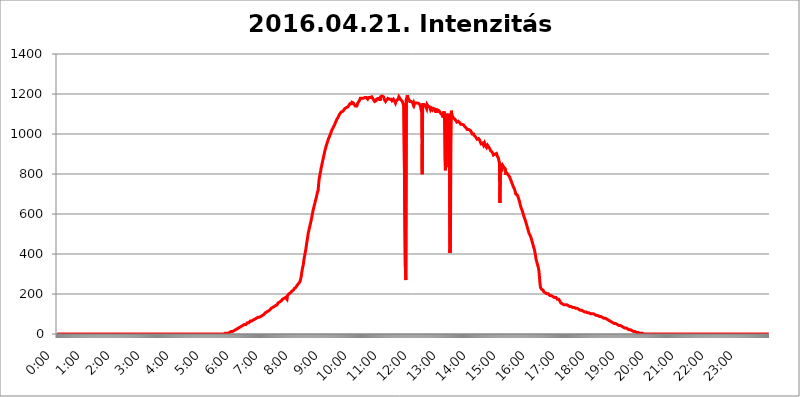
| Category | 2016.04.21. Intenzitás [W/m^2] |
|---|---|
| 0.0 | 0 |
| 0.0006944444444444445 | 0 |
| 0.001388888888888889 | 0 |
| 0.0020833333333333333 | 0 |
| 0.002777777777777778 | 0 |
| 0.003472222222222222 | 0 |
| 0.004166666666666667 | 0 |
| 0.004861111111111111 | 0 |
| 0.005555555555555556 | 0 |
| 0.0062499999999999995 | 0 |
| 0.006944444444444444 | 0 |
| 0.007638888888888889 | 0 |
| 0.008333333333333333 | 0 |
| 0.009027777777777779 | 0 |
| 0.009722222222222222 | 0 |
| 0.010416666666666666 | 0 |
| 0.011111111111111112 | 0 |
| 0.011805555555555555 | 0 |
| 0.012499999999999999 | 0 |
| 0.013194444444444444 | 0 |
| 0.013888888888888888 | 0 |
| 0.014583333333333332 | 0 |
| 0.015277777777777777 | 0 |
| 0.015972222222222224 | 0 |
| 0.016666666666666666 | 0 |
| 0.017361111111111112 | 0 |
| 0.018055555555555557 | 0 |
| 0.01875 | 0 |
| 0.019444444444444445 | 0 |
| 0.02013888888888889 | 0 |
| 0.020833333333333332 | 0 |
| 0.02152777777777778 | 0 |
| 0.022222222222222223 | 0 |
| 0.02291666666666667 | 0 |
| 0.02361111111111111 | 0 |
| 0.024305555555555556 | 0 |
| 0.024999999999999998 | 0 |
| 0.025694444444444447 | 0 |
| 0.02638888888888889 | 0 |
| 0.027083333333333334 | 0 |
| 0.027777777777777776 | 0 |
| 0.02847222222222222 | 0 |
| 0.029166666666666664 | 0 |
| 0.029861111111111113 | 0 |
| 0.030555555555555555 | 0 |
| 0.03125 | 0 |
| 0.03194444444444445 | 0 |
| 0.03263888888888889 | 0 |
| 0.03333333333333333 | 0 |
| 0.034027777777777775 | 0 |
| 0.034722222222222224 | 0 |
| 0.035416666666666666 | 0 |
| 0.036111111111111115 | 0 |
| 0.03680555555555556 | 0 |
| 0.0375 | 0 |
| 0.03819444444444444 | 0 |
| 0.03888888888888889 | 0 |
| 0.03958333333333333 | 0 |
| 0.04027777777777778 | 0 |
| 0.04097222222222222 | 0 |
| 0.041666666666666664 | 0 |
| 0.042361111111111106 | 0 |
| 0.04305555555555556 | 0 |
| 0.043750000000000004 | 0 |
| 0.044444444444444446 | 0 |
| 0.04513888888888889 | 0 |
| 0.04583333333333334 | 0 |
| 0.04652777777777778 | 0 |
| 0.04722222222222222 | 0 |
| 0.04791666666666666 | 0 |
| 0.04861111111111111 | 0 |
| 0.049305555555555554 | 0 |
| 0.049999999999999996 | 0 |
| 0.05069444444444445 | 0 |
| 0.051388888888888894 | 0 |
| 0.052083333333333336 | 0 |
| 0.05277777777777778 | 0 |
| 0.05347222222222222 | 0 |
| 0.05416666666666667 | 0 |
| 0.05486111111111111 | 0 |
| 0.05555555555555555 | 0 |
| 0.05625 | 0 |
| 0.05694444444444444 | 0 |
| 0.057638888888888885 | 0 |
| 0.05833333333333333 | 0 |
| 0.05902777777777778 | 0 |
| 0.059722222222222225 | 0 |
| 0.06041666666666667 | 0 |
| 0.061111111111111116 | 0 |
| 0.06180555555555556 | 0 |
| 0.0625 | 0 |
| 0.06319444444444444 | 0 |
| 0.06388888888888888 | 0 |
| 0.06458333333333334 | 0 |
| 0.06527777777777778 | 0 |
| 0.06597222222222222 | 0 |
| 0.06666666666666667 | 0 |
| 0.06736111111111111 | 0 |
| 0.06805555555555555 | 0 |
| 0.06874999999999999 | 0 |
| 0.06944444444444443 | 0 |
| 0.07013888888888889 | 0 |
| 0.07083333333333333 | 0 |
| 0.07152777777777779 | 0 |
| 0.07222222222222223 | 0 |
| 0.07291666666666667 | 0 |
| 0.07361111111111111 | 0 |
| 0.07430555555555556 | 0 |
| 0.075 | 0 |
| 0.07569444444444444 | 0 |
| 0.0763888888888889 | 0 |
| 0.07708333333333334 | 0 |
| 0.07777777777777778 | 0 |
| 0.07847222222222222 | 0 |
| 0.07916666666666666 | 0 |
| 0.0798611111111111 | 0 |
| 0.08055555555555556 | 0 |
| 0.08125 | 0 |
| 0.08194444444444444 | 0 |
| 0.08263888888888889 | 0 |
| 0.08333333333333333 | 0 |
| 0.08402777777777777 | 0 |
| 0.08472222222222221 | 0 |
| 0.08541666666666665 | 0 |
| 0.08611111111111112 | 0 |
| 0.08680555555555557 | 0 |
| 0.08750000000000001 | 0 |
| 0.08819444444444445 | 0 |
| 0.08888888888888889 | 0 |
| 0.08958333333333333 | 0 |
| 0.09027777777777778 | 0 |
| 0.09097222222222222 | 0 |
| 0.09166666666666667 | 0 |
| 0.09236111111111112 | 0 |
| 0.09305555555555556 | 0 |
| 0.09375 | 0 |
| 0.09444444444444444 | 0 |
| 0.09513888888888888 | 0 |
| 0.09583333333333333 | 0 |
| 0.09652777777777777 | 0 |
| 0.09722222222222222 | 0 |
| 0.09791666666666667 | 0 |
| 0.09861111111111111 | 0 |
| 0.09930555555555555 | 0 |
| 0.09999999999999999 | 0 |
| 0.10069444444444443 | 0 |
| 0.1013888888888889 | 0 |
| 0.10208333333333335 | 0 |
| 0.10277777777777779 | 0 |
| 0.10347222222222223 | 0 |
| 0.10416666666666667 | 0 |
| 0.10486111111111111 | 0 |
| 0.10555555555555556 | 0 |
| 0.10625 | 0 |
| 0.10694444444444444 | 0 |
| 0.1076388888888889 | 0 |
| 0.10833333333333334 | 0 |
| 0.10902777777777778 | 0 |
| 0.10972222222222222 | 0 |
| 0.1111111111111111 | 0 |
| 0.11180555555555556 | 0 |
| 0.11180555555555556 | 0 |
| 0.1125 | 0 |
| 0.11319444444444444 | 0 |
| 0.11388888888888889 | 0 |
| 0.11458333333333333 | 0 |
| 0.11527777777777777 | 0 |
| 0.11597222222222221 | 0 |
| 0.11666666666666665 | 0 |
| 0.1173611111111111 | 0 |
| 0.11805555555555557 | 0 |
| 0.11944444444444445 | 0 |
| 0.12013888888888889 | 0 |
| 0.12083333333333333 | 0 |
| 0.12152777777777778 | 0 |
| 0.12222222222222223 | 0 |
| 0.12291666666666667 | 0 |
| 0.12291666666666667 | 0 |
| 0.12361111111111112 | 0 |
| 0.12430555555555556 | 0 |
| 0.125 | 0 |
| 0.12569444444444444 | 0 |
| 0.12638888888888888 | 0 |
| 0.12708333333333333 | 0 |
| 0.16875 | 0 |
| 0.12847222222222224 | 0 |
| 0.12916666666666668 | 0 |
| 0.12986111111111112 | 0 |
| 0.13055555555555556 | 0 |
| 0.13125 | 0 |
| 0.13194444444444445 | 0 |
| 0.1326388888888889 | 0 |
| 0.13333333333333333 | 0 |
| 0.13402777777777777 | 0 |
| 0.13402777777777777 | 0 |
| 0.13472222222222222 | 0 |
| 0.13541666666666666 | 0 |
| 0.1361111111111111 | 0 |
| 0.13749999999999998 | 0 |
| 0.13819444444444443 | 0 |
| 0.1388888888888889 | 0 |
| 0.13958333333333334 | 0 |
| 0.14027777777777778 | 0 |
| 0.14097222222222222 | 0 |
| 0.14166666666666666 | 0 |
| 0.1423611111111111 | 0 |
| 0.14305555555555557 | 0 |
| 0.14375000000000002 | 0 |
| 0.14444444444444446 | 0 |
| 0.1451388888888889 | 0 |
| 0.1451388888888889 | 0 |
| 0.14652777777777778 | 0 |
| 0.14722222222222223 | 0 |
| 0.14791666666666667 | 0 |
| 0.1486111111111111 | 0 |
| 0.14930555555555555 | 0 |
| 0.15 | 0 |
| 0.15069444444444444 | 0 |
| 0.15138888888888888 | 0 |
| 0.15208333333333332 | 0 |
| 0.15277777777777776 | 0 |
| 0.15347222222222223 | 0 |
| 0.15416666666666667 | 0 |
| 0.15486111111111112 | 0 |
| 0.15555555555555556 | 0 |
| 0.15625 | 0 |
| 0.15694444444444444 | 0 |
| 0.15763888888888888 | 0 |
| 0.15833333333333333 | 0 |
| 0.15902777777777777 | 0 |
| 0.15972222222222224 | 0 |
| 0.16041666666666668 | 0 |
| 0.16111111111111112 | 0 |
| 0.16180555555555556 | 0 |
| 0.1625 | 0 |
| 0.16319444444444445 | 0 |
| 0.1638888888888889 | 0 |
| 0.16458333333333333 | 0 |
| 0.16527777777777777 | 0 |
| 0.16597222222222222 | 0 |
| 0.16666666666666666 | 0 |
| 0.1673611111111111 | 0 |
| 0.16805555555555554 | 0 |
| 0.16874999999999998 | 0 |
| 0.16944444444444443 | 0 |
| 0.17013888888888887 | 0 |
| 0.1708333333333333 | 0 |
| 0.17152777777777775 | 0 |
| 0.17222222222222225 | 0 |
| 0.1729166666666667 | 0 |
| 0.17361111111111113 | 0 |
| 0.17430555555555557 | 0 |
| 0.17500000000000002 | 0 |
| 0.17569444444444446 | 0 |
| 0.1763888888888889 | 0 |
| 0.17708333333333334 | 0 |
| 0.17777777777777778 | 0 |
| 0.17847222222222223 | 0 |
| 0.17916666666666667 | 0 |
| 0.1798611111111111 | 0 |
| 0.18055555555555555 | 0 |
| 0.18125 | 0 |
| 0.18194444444444444 | 0 |
| 0.1826388888888889 | 0 |
| 0.18333333333333335 | 0 |
| 0.1840277777777778 | 0 |
| 0.18472222222222223 | 0 |
| 0.18541666666666667 | 0 |
| 0.18611111111111112 | 0 |
| 0.18680555555555556 | 0 |
| 0.1875 | 0 |
| 0.18819444444444444 | 0 |
| 0.18888888888888888 | 0 |
| 0.18958333333333333 | 0 |
| 0.19027777777777777 | 0 |
| 0.1909722222222222 | 0 |
| 0.19166666666666665 | 0 |
| 0.19236111111111112 | 0 |
| 0.19305555555555554 | 0 |
| 0.19375 | 0 |
| 0.19444444444444445 | 0 |
| 0.1951388888888889 | 0 |
| 0.19583333333333333 | 0 |
| 0.19652777777777777 | 0 |
| 0.19722222222222222 | 0 |
| 0.19791666666666666 | 0 |
| 0.1986111111111111 | 0 |
| 0.19930555555555554 | 0 |
| 0.19999999999999998 | 0 |
| 0.20069444444444443 | 0 |
| 0.20138888888888887 | 0 |
| 0.2020833333333333 | 0 |
| 0.2027777777777778 | 0 |
| 0.2034722222222222 | 0 |
| 0.2041666666666667 | 0 |
| 0.20486111111111113 | 0 |
| 0.20555555555555557 | 0 |
| 0.20625000000000002 | 0 |
| 0.20694444444444446 | 0 |
| 0.2076388888888889 | 0 |
| 0.20833333333333334 | 0 |
| 0.20902777777777778 | 0 |
| 0.20972222222222223 | 0 |
| 0.21041666666666667 | 0 |
| 0.2111111111111111 | 0 |
| 0.21180555555555555 | 0 |
| 0.2125 | 0 |
| 0.21319444444444444 | 0 |
| 0.2138888888888889 | 0 |
| 0.21458333333333335 | 0 |
| 0.2152777777777778 | 0 |
| 0.21597222222222223 | 0 |
| 0.21666666666666667 | 0 |
| 0.21736111111111112 | 0 |
| 0.21805555555555556 | 0 |
| 0.21875 | 0 |
| 0.21944444444444444 | 0 |
| 0.22013888888888888 | 0 |
| 0.22083333333333333 | 0 |
| 0.22152777777777777 | 0 |
| 0.2222222222222222 | 0 |
| 0.22291666666666665 | 0 |
| 0.2236111111111111 | 0 |
| 0.22430555555555556 | 0 |
| 0.225 | 0 |
| 0.22569444444444445 | 0 |
| 0.2263888888888889 | 0 |
| 0.22708333333333333 | 0 |
| 0.22777777777777777 | 0 |
| 0.22847222222222222 | 0 |
| 0.22916666666666666 | 0 |
| 0.2298611111111111 | 0 |
| 0.23055555555555554 | 0 |
| 0.23124999999999998 | 0 |
| 0.23194444444444443 | 0 |
| 0.23263888888888887 | 0 |
| 0.2333333333333333 | 0 |
| 0.2340277777777778 | 0 |
| 0.2347222222222222 | 3.525 |
| 0.2354166666666667 | 3.525 |
| 0.23611111111111113 | 3.525 |
| 0.23680555555555557 | 3.525 |
| 0.23750000000000002 | 3.525 |
| 0.23819444444444446 | 3.525 |
| 0.2388888888888889 | 3.525 |
| 0.23958333333333334 | 3.525 |
| 0.24027777777777778 | 3.525 |
| 0.24097222222222223 | 7.887 |
| 0.24166666666666667 | 7.887 |
| 0.2423611111111111 | 7.887 |
| 0.24305555555555555 | 7.887 |
| 0.24375 | 12.257 |
| 0.24444444444444446 | 12.257 |
| 0.24513888888888888 | 12.257 |
| 0.24583333333333335 | 12.257 |
| 0.2465277777777778 | 12.257 |
| 0.24722222222222223 | 16.636 |
| 0.24791666666666667 | 16.636 |
| 0.24861111111111112 | 16.636 |
| 0.24930555555555556 | 21.024 |
| 0.25 | 21.024 |
| 0.25069444444444444 | 21.024 |
| 0.2513888888888889 | 25.419 |
| 0.2520833333333333 | 25.419 |
| 0.25277777777777777 | 25.419 |
| 0.2534722222222222 | 29.823 |
| 0.25416666666666665 | 29.823 |
| 0.2548611111111111 | 29.823 |
| 0.2555555555555556 | 34.234 |
| 0.25625000000000003 | 34.234 |
| 0.2569444444444445 | 34.234 |
| 0.2576388888888889 | 38.653 |
| 0.25833333333333336 | 38.653 |
| 0.2590277777777778 | 38.653 |
| 0.25972222222222224 | 38.653 |
| 0.2604166666666667 | 43.079 |
| 0.2611111111111111 | 43.079 |
| 0.26180555555555557 | 43.079 |
| 0.2625 | 47.511 |
| 0.26319444444444445 | 47.511 |
| 0.2638888888888889 | 47.511 |
| 0.26458333333333334 | 47.511 |
| 0.2652777777777778 | 51.951 |
| 0.2659722222222222 | 51.951 |
| 0.26666666666666666 | 56.398 |
| 0.2673611111111111 | 56.398 |
| 0.26805555555555555 | 56.398 |
| 0.26875 | 56.398 |
| 0.26944444444444443 | 60.85 |
| 0.2701388888888889 | 60.85 |
| 0.2708333333333333 | 65.31 |
| 0.27152777777777776 | 65.31 |
| 0.2722222222222222 | 65.31 |
| 0.27291666666666664 | 65.31 |
| 0.2736111111111111 | 65.31 |
| 0.2743055555555555 | 69.775 |
| 0.27499999999999997 | 69.775 |
| 0.27569444444444446 | 74.246 |
| 0.27638888888888885 | 74.246 |
| 0.27708333333333335 | 74.246 |
| 0.2777777777777778 | 74.246 |
| 0.27847222222222223 | 78.722 |
| 0.2791666666666667 | 78.722 |
| 0.2798611111111111 | 78.722 |
| 0.28055555555555556 | 78.722 |
| 0.28125 | 83.205 |
| 0.28194444444444444 | 83.205 |
| 0.2826388888888889 | 83.205 |
| 0.2833333333333333 | 83.205 |
| 0.28402777777777777 | 87.692 |
| 0.2847222222222222 | 87.692 |
| 0.28541666666666665 | 87.692 |
| 0.28611111111111115 | 92.184 |
| 0.28680555555555554 | 92.184 |
| 0.28750000000000003 | 92.184 |
| 0.2881944444444445 | 92.184 |
| 0.2888888888888889 | 96.682 |
| 0.28958333333333336 | 96.682 |
| 0.2902777777777778 | 101.184 |
| 0.29097222222222224 | 101.184 |
| 0.2916666666666667 | 105.69 |
| 0.2923611111111111 | 105.69 |
| 0.29305555555555557 | 105.69 |
| 0.29375 | 110.201 |
| 0.29444444444444445 | 110.201 |
| 0.2951388888888889 | 110.201 |
| 0.29583333333333334 | 114.716 |
| 0.2965277777777778 | 114.716 |
| 0.2972222222222222 | 119.235 |
| 0.29791666666666666 | 119.235 |
| 0.2986111111111111 | 119.235 |
| 0.29930555555555555 | 123.758 |
| 0.3 | 128.284 |
| 0.30069444444444443 | 128.284 |
| 0.3013888888888889 | 128.284 |
| 0.3020833333333333 | 132.814 |
| 0.30277777777777776 | 132.814 |
| 0.3034722222222222 | 137.347 |
| 0.30416666666666664 | 137.347 |
| 0.3048611111111111 | 137.347 |
| 0.3055555555555555 | 141.884 |
| 0.30624999999999997 | 141.884 |
| 0.3069444444444444 | 146.423 |
| 0.3076388888888889 | 146.423 |
| 0.30833333333333335 | 146.423 |
| 0.3090277777777778 | 150.964 |
| 0.30972222222222223 | 155.509 |
| 0.3104166666666667 | 155.509 |
| 0.3111111111111111 | 155.509 |
| 0.31180555555555556 | 160.056 |
| 0.3125 | 160.056 |
| 0.31319444444444444 | 164.605 |
| 0.3138888888888889 | 164.605 |
| 0.3145833333333333 | 169.156 |
| 0.31527777777777777 | 169.156 |
| 0.3159722222222222 | 173.709 |
| 0.31666666666666665 | 173.709 |
| 0.31736111111111115 | 173.709 |
| 0.31805555555555554 | 178.264 |
| 0.31875000000000003 | 182.82 |
| 0.3194444444444445 | 182.82 |
| 0.3201388888888889 | 182.82 |
| 0.32083333333333336 | 187.378 |
| 0.3215277777777778 | 187.378 |
| 0.32222222222222224 | 173.709 |
| 0.3229166666666667 | 191.937 |
| 0.3236111111111111 | 191.937 |
| 0.32430555555555557 | 196.497 |
| 0.325 | 201.058 |
| 0.32569444444444445 | 201.058 |
| 0.3263888888888889 | 201.058 |
| 0.32708333333333334 | 205.62 |
| 0.3277777777777778 | 210.182 |
| 0.3284722222222222 | 210.182 |
| 0.32916666666666666 | 214.746 |
| 0.3298611111111111 | 214.746 |
| 0.33055555555555555 | 219.309 |
| 0.33125 | 219.309 |
| 0.33194444444444443 | 223.873 |
| 0.3326388888888889 | 228.436 |
| 0.3333333333333333 | 228.436 |
| 0.3340277777777778 | 233 |
| 0.3347222222222222 | 233 |
| 0.3354166666666667 | 237.564 |
| 0.3361111111111111 | 242.127 |
| 0.3368055555555556 | 242.127 |
| 0.33749999999999997 | 246.689 |
| 0.33819444444444446 | 251.251 |
| 0.33888888888888885 | 251.251 |
| 0.33958333333333335 | 255.813 |
| 0.34027777777777773 | 260.373 |
| 0.34097222222222223 | 269.49 |
| 0.3416666666666666 | 278.603 |
| 0.3423611111111111 | 292.259 |
| 0.3430555555555555 | 310.44 |
| 0.34375 | 324.052 |
| 0.3444444444444445 | 337.639 |
| 0.3451388888888889 | 346.682 |
| 0.3458333333333334 | 369.23 |
| 0.34652777777777777 | 382.715 |
| 0.34722222222222227 | 396.164 |
| 0.34791666666666665 | 409.574 |
| 0.34861111111111115 | 422.943 |
| 0.34930555555555554 | 440.702 |
| 0.35000000000000003 | 458.38 |
| 0.3506944444444444 | 471.582 |
| 0.3513888888888889 | 489.108 |
| 0.3520833333333333 | 506.542 |
| 0.3527777777777778 | 515.223 |
| 0.3534722222222222 | 528.2 |
| 0.3541666666666667 | 536.82 |
| 0.3548611111111111 | 549.704 |
| 0.35555555555555557 | 558.261 |
| 0.35625 | 571.049 |
| 0.35694444444444445 | 583.779 |
| 0.3576388888888889 | 596.45 |
| 0.35833333333333334 | 609.062 |
| 0.3590277777777778 | 621.613 |
| 0.3597222222222222 | 629.948 |
| 0.36041666666666666 | 642.4 |
| 0.3611111111111111 | 650.667 |
| 0.36180555555555555 | 663.019 |
| 0.3625 | 671.22 |
| 0.36319444444444443 | 679.395 |
| 0.3638888888888889 | 691.608 |
| 0.3645833333333333 | 703.762 |
| 0.3652777777777778 | 711.832 |
| 0.3659722222222222 | 719.877 |
| 0.3666666666666667 | 751.803 |
| 0.3673611111111111 | 775.492 |
| 0.3680555555555556 | 787.258 |
| 0.36874999999999997 | 802.868 |
| 0.36944444444444446 | 814.519 |
| 0.37013888888888885 | 829.981 |
| 0.37083333333333335 | 841.526 |
| 0.37152777777777773 | 853.029 |
| 0.37222222222222223 | 864.493 |
| 0.3729166666666666 | 875.918 |
| 0.3736111111111111 | 887.309 |
| 0.3743055555555555 | 898.668 |
| 0.375 | 909.996 |
| 0.3756944444444445 | 921.298 |
| 0.3763888888888889 | 928.819 |
| 0.3770833333333334 | 940.082 |
| 0.37777777777777777 | 947.58 |
| 0.37847222222222227 | 955.071 |
| 0.37916666666666665 | 962.555 |
| 0.37986111111111115 | 970.034 |
| 0.38055555555555554 | 977.508 |
| 0.38125000000000003 | 981.244 |
| 0.3819444444444444 | 988.714 |
| 0.3826388888888889 | 996.182 |
| 0.3833333333333333 | 999.916 |
| 0.3840277777777778 | 1007.383 |
| 0.3847222222222222 | 1014.852 |
| 0.3854166666666667 | 1022.323 |
| 0.3861111111111111 | 1026.06 |
| 0.38680555555555557 | 1029.798 |
| 0.3875 | 1037.277 |
| 0.38819444444444445 | 1041.019 |
| 0.3888888888888889 | 1044.762 |
| 0.38958333333333334 | 1052.255 |
| 0.3902777777777778 | 1056.004 |
| 0.3909722222222222 | 1063.51 |
| 0.39166666666666666 | 1067.267 |
| 0.3923611111111111 | 1074.789 |
| 0.39305555555555555 | 1078.555 |
| 0.39375 | 1082.324 |
| 0.39444444444444443 | 1086.097 |
| 0.3951388888888889 | 1093.653 |
| 0.3958333333333333 | 1093.653 |
| 0.3965277777777778 | 1101.226 |
| 0.3972222222222222 | 1105.019 |
| 0.3979166666666667 | 1108.816 |
| 0.3986111111111111 | 1108.816 |
| 0.3993055555555556 | 1108.816 |
| 0.39999999999999997 | 1112.618 |
| 0.40069444444444446 | 1112.618 |
| 0.40138888888888885 | 1116.426 |
| 0.40208333333333335 | 1120.238 |
| 0.40277777777777773 | 1124.056 |
| 0.40347222222222223 | 1127.879 |
| 0.4041666666666666 | 1127.879 |
| 0.4048611111111111 | 1127.879 |
| 0.4055555555555555 | 1131.708 |
| 0.40625 | 1135.543 |
| 0.4069444444444445 | 1135.543 |
| 0.4076388888888889 | 1135.543 |
| 0.4083333333333334 | 1139.384 |
| 0.40902777777777777 | 1143.232 |
| 0.40972222222222227 | 1147.086 |
| 0.41041666666666665 | 1150.946 |
| 0.41111111111111115 | 1154.814 |
| 0.41180555555555554 | 1154.814 |
| 0.41250000000000003 | 1150.946 |
| 0.4131944444444444 | 1158.689 |
| 0.4138888888888889 | 1162.571 |
| 0.4145833333333333 | 1158.689 |
| 0.4152777777777778 | 1154.814 |
| 0.4159722222222222 | 1150.946 |
| 0.4166666666666667 | 1147.086 |
| 0.4173611111111111 | 1143.232 |
| 0.41805555555555557 | 1139.384 |
| 0.41875 | 1139.384 |
| 0.41944444444444445 | 1139.384 |
| 0.4201388888888889 | 1139.384 |
| 0.42083333333333334 | 1147.086 |
| 0.4215277777777778 | 1154.814 |
| 0.4222222222222222 | 1158.689 |
| 0.42291666666666666 | 1162.571 |
| 0.4236111111111111 | 1166.46 |
| 0.42430555555555555 | 1170.358 |
| 0.425 | 1178.177 |
| 0.42569444444444443 | 1178.177 |
| 0.4263888888888889 | 1178.177 |
| 0.4270833333333333 | 1178.177 |
| 0.4277777777777778 | 1174.263 |
| 0.4284722222222222 | 1178.177 |
| 0.4291666666666667 | 1178.177 |
| 0.4298611111111111 | 1178.177 |
| 0.4305555555555556 | 1182.099 |
| 0.43124999999999997 | 1182.099 |
| 0.43194444444444446 | 1182.099 |
| 0.43263888888888885 | 1182.099 |
| 0.43333333333333335 | 1182.099 |
| 0.43402777777777773 | 1182.099 |
| 0.43472222222222223 | 1182.099 |
| 0.4354166666666666 | 1174.263 |
| 0.4361111111111111 | 1178.177 |
| 0.4368055555555555 | 1182.099 |
| 0.4375 | 1182.099 |
| 0.4381944444444445 | 1182.099 |
| 0.4388888888888889 | 1182.099 |
| 0.4395833333333334 | 1178.177 |
| 0.44027777777777777 | 1182.099 |
| 0.44097222222222227 | 1186.03 |
| 0.44166666666666665 | 1182.099 |
| 0.44236111111111115 | 1178.177 |
| 0.44305555555555554 | 1174.263 |
| 0.44375000000000003 | 1170.358 |
| 0.4444444444444444 | 1170.358 |
| 0.4451388888888889 | 1162.571 |
| 0.4458333333333333 | 1158.689 |
| 0.4465277777777778 | 1162.571 |
| 0.4472222222222222 | 1166.46 |
| 0.4479166666666667 | 1174.263 |
| 0.4486111111111111 | 1178.177 |
| 0.44930555555555557 | 1174.263 |
| 0.45 | 1178.177 |
| 0.45069444444444445 | 1182.099 |
| 0.4513888888888889 | 1178.177 |
| 0.45208333333333334 | 1174.263 |
| 0.4527777777777778 | 1166.46 |
| 0.4534722222222222 | 1186.03 |
| 0.45416666666666666 | 1189.969 |
| 0.4548611111111111 | 1189.969 |
| 0.45555555555555555 | 1189.969 |
| 0.45625 | 1189.969 |
| 0.45694444444444443 | 1186.03 |
| 0.4576388888888889 | 1186.03 |
| 0.4583333333333333 | 1178.177 |
| 0.4590277777777778 | 1170.358 |
| 0.4597222222222222 | 1170.358 |
| 0.4604166666666667 | 1162.571 |
| 0.4611111111111111 | 1162.571 |
| 0.4618055555555556 | 1170.358 |
| 0.46249999999999997 | 1170.358 |
| 0.46319444444444446 | 1170.358 |
| 0.46388888888888885 | 1178.177 |
| 0.46458333333333335 | 1178.177 |
| 0.46527777777777773 | 1178.177 |
| 0.46597222222222223 | 1174.263 |
| 0.4666666666666666 | 1170.358 |
| 0.4673611111111111 | 1170.358 |
| 0.4680555555555555 | 1174.263 |
| 0.46875 | 1170.358 |
| 0.4694444444444445 | 1166.46 |
| 0.4701388888888889 | 1166.46 |
| 0.4708333333333334 | 1170.358 |
| 0.47152777777777777 | 1174.263 |
| 0.47222222222222227 | 1170.358 |
| 0.47291666666666665 | 1166.46 |
| 0.47361111111111115 | 1166.46 |
| 0.47430555555555554 | 1154.814 |
| 0.47500000000000003 | 1162.571 |
| 0.4756944444444444 | 1166.46 |
| 0.4763888888888889 | 1166.46 |
| 0.4770833333333333 | 1170.358 |
| 0.4777777777777778 | 1170.358 |
| 0.4784722222222222 | 1178.177 |
| 0.4791666666666667 | 1186.03 |
| 0.4798611111111111 | 1182.099 |
| 0.48055555555555557 | 1178.177 |
| 0.48125 | 1178.177 |
| 0.48194444444444445 | 1170.358 |
| 0.4826388888888889 | 1166.46 |
| 0.48333333333333334 | 1166.46 |
| 0.4840277777777778 | 1162.571 |
| 0.4847222222222222 | 1162.571 |
| 0.48541666666666666 | 1147.086 |
| 0.4861111111111111 | 1154.814 |
| 0.48680555555555555 | 1158.689 |
| 0.4875 | 1158.689 |
| 0.48819444444444443 | 337.639 |
| 0.4888888888888889 | 269.49 |
| 0.4895833333333333 | 1174.263 |
| 0.4902777777777778 | 1182.099 |
| 0.4909722222222222 | 1193.918 |
| 0.4916666666666667 | 1182.099 |
| 0.4923611111111111 | 1178.177 |
| 0.4930555555555556 | 1174.263 |
| 0.49374999999999997 | 1170.358 |
| 0.49444444444444446 | 1162.571 |
| 0.49513888888888885 | 1162.571 |
| 0.49583333333333335 | 1162.571 |
| 0.49652777777777773 | 1162.571 |
| 0.49722222222222223 | 1162.571 |
| 0.4979166666666666 | 1158.689 |
| 0.4986111111111111 | 1154.814 |
| 0.4993055555555555 | 1147.086 |
| 0.5 | 1154.814 |
| 0.5006944444444444 | 1147.086 |
| 0.5013888888888889 | 1154.814 |
| 0.5020833333333333 | 1150.946 |
| 0.5027777777777778 | 1150.946 |
| 0.5034722222222222 | 1154.814 |
| 0.5041666666666667 | 1154.814 |
| 0.5048611111111111 | 1150.946 |
| 0.5055555555555555 | 1154.814 |
| 0.50625 | 1150.946 |
| 0.5069444444444444 | 1150.946 |
| 0.5076388888888889 | 1150.946 |
| 0.5083333333333333 | 1150.946 |
| 0.5090277777777777 | 1143.232 |
| 0.5097222222222222 | 1147.086 |
| 0.5104166666666666 | 1147.086 |
| 0.5111111111111112 | 1108.816 |
| 0.5118055555555555 | 798.974 |
| 0.5125000000000001 | 1147.086 |
| 0.5131944444444444 | 1147.086 |
| 0.513888888888889 | 1147.086 |
| 0.5145833333333333 | 1147.086 |
| 0.5152777777777778 | 1147.086 |
| 0.5159722222222222 | 1147.086 |
| 0.5166666666666667 | 1139.384 |
| 0.517361111111111 | 1143.232 |
| 0.5180555555555556 | 1127.879 |
| 0.5187499999999999 | 1147.086 |
| 0.5194444444444445 | 1143.232 |
| 0.5201388888888888 | 1139.384 |
| 0.5208333333333334 | 1135.543 |
| 0.5215277777777778 | 1135.543 |
| 0.5222222222222223 | 1135.543 |
| 0.5229166666666667 | 1127.879 |
| 0.5236111111111111 | 1120.238 |
| 0.5243055555555556 | 1124.056 |
| 0.525 | 1127.879 |
| 0.5256944444444445 | 1124.056 |
| 0.5263888888888889 | 1120.238 |
| 0.5270833333333333 | 1124.056 |
| 0.5277777777777778 | 1127.879 |
| 0.5284722222222222 | 1131.708 |
| 0.5291666666666667 | 1127.879 |
| 0.5298611111111111 | 1124.056 |
| 0.5305555555555556 | 1112.618 |
| 0.53125 | 1108.816 |
| 0.5319444444444444 | 1108.816 |
| 0.5326388888888889 | 1112.618 |
| 0.5333333333333333 | 1120.238 |
| 0.5340277777777778 | 1116.426 |
| 0.5347222222222222 | 1116.426 |
| 0.5354166666666667 | 1116.426 |
| 0.5361111111111111 | 1112.618 |
| 0.5368055555555555 | 1108.816 |
| 0.5375 | 1108.816 |
| 0.5381944444444444 | 1101.226 |
| 0.5388888888888889 | 1101.226 |
| 0.5395833333333333 | 1101.226 |
| 0.5402777777777777 | 1093.653 |
| 0.5409722222222222 | 1082.324 |
| 0.5416666666666666 | 1086.097 |
| 0.5423611111111112 | 1112.618 |
| 0.5430555555555555 | 1101.226 |
| 0.5437500000000001 | 879.719 |
| 0.5444444444444444 | 818.392 |
| 0.545138888888889 | 1037.277 |
| 0.5458333333333333 | 1101.226 |
| 0.5465277777777778 | 1093.653 |
| 0.5472222222222222 | 1089.873 |
| 0.5479166666666667 | 1086.097 |
| 0.548611111111111 | 1089.873 |
| 0.5493055555555556 | 833.834 |
| 0.5499999999999999 | 1101.226 |
| 0.5506944444444445 | 405.108 |
| 0.5513888888888888 | 427.39 |
| 0.5520833333333334 | 940.082 |
| 0.5527777777777778 | 1116.426 |
| 0.5534722222222223 | 1093.653 |
| 0.5541666666666667 | 1093.653 |
| 0.5548611111111111 | 1086.097 |
| 0.5555555555555556 | 1078.555 |
| 0.55625 | 1078.555 |
| 0.5569444444444445 | 1074.789 |
| 0.5576388888888889 | 1074.789 |
| 0.5583333333333333 | 1074.789 |
| 0.5590277777777778 | 1067.267 |
| 0.5597222222222222 | 1063.51 |
| 0.5604166666666667 | 1059.756 |
| 0.5611111111111111 | 1063.51 |
| 0.5618055555555556 | 1063.51 |
| 0.5625 | 1063.51 |
| 0.5631944444444444 | 1063.51 |
| 0.5638888888888889 | 1059.756 |
| 0.5645833333333333 | 1056.004 |
| 0.5652777777777778 | 1052.255 |
| 0.5659722222222222 | 1048.508 |
| 0.5666666666666667 | 1052.255 |
| 0.5673611111111111 | 1048.508 |
| 0.5680555555555555 | 1048.508 |
| 0.56875 | 1044.762 |
| 0.5694444444444444 | 1044.762 |
| 0.5701388888888889 | 1044.762 |
| 0.5708333333333333 | 1041.019 |
| 0.5715277777777777 | 1037.277 |
| 0.5722222222222222 | 1041.019 |
| 0.5729166666666666 | 1037.277 |
| 0.5736111111111112 | 1029.798 |
| 0.5743055555555555 | 1029.798 |
| 0.5750000000000001 | 1022.323 |
| 0.5756944444444444 | 1026.06 |
| 0.576388888888889 | 1026.06 |
| 0.5770833333333333 | 1022.323 |
| 0.5777777777777778 | 1018.587 |
| 0.5784722222222222 | 1022.323 |
| 0.5791666666666667 | 1018.587 |
| 0.579861111111111 | 1014.852 |
| 0.5805555555555556 | 1011.118 |
| 0.5812499999999999 | 1011.118 |
| 0.5819444444444445 | 999.916 |
| 0.5826388888888888 | 999.916 |
| 0.5833333333333334 | 999.916 |
| 0.5840277777777778 | 999.916 |
| 0.5847222222222223 | 992.448 |
| 0.5854166666666667 | 992.448 |
| 0.5861111111111111 | 992.448 |
| 0.5868055555555556 | 984.98 |
| 0.5875 | 981.244 |
| 0.5881944444444445 | 984.98 |
| 0.5888888888888889 | 973.772 |
| 0.5895833333333333 | 973.772 |
| 0.5902777777777778 | 973.772 |
| 0.5909722222222222 | 977.508 |
| 0.5916666666666667 | 973.772 |
| 0.5923611111111111 | 970.034 |
| 0.5930555555555556 | 962.555 |
| 0.59375 | 962.555 |
| 0.5944444444444444 | 951.327 |
| 0.5951388888888889 | 951.327 |
| 0.5958333333333333 | 955.071 |
| 0.5965277777777778 | 955.071 |
| 0.5972222222222222 | 951.327 |
| 0.5979166666666667 | 943.832 |
| 0.5986111111111111 | 947.58 |
| 0.5993055555555555 | 955.071 |
| 0.6 | 947.58 |
| 0.6006944444444444 | 940.082 |
| 0.6013888888888889 | 940.082 |
| 0.6020833333333333 | 932.576 |
| 0.6027777777777777 | 936.33 |
| 0.6034722222222222 | 943.832 |
| 0.6041666666666666 | 940.082 |
| 0.6048611111111112 | 940.082 |
| 0.6055555555555555 | 932.576 |
| 0.6062500000000001 | 928.819 |
| 0.6069444444444444 | 925.06 |
| 0.607638888888889 | 917.534 |
| 0.6083333333333333 | 917.534 |
| 0.6090277777777778 | 913.766 |
| 0.6097222222222222 | 909.996 |
| 0.6104166666666667 | 906.223 |
| 0.611111111111111 | 902.447 |
| 0.6118055555555556 | 894.885 |
| 0.6124999999999999 | 894.885 |
| 0.6131944444444445 | 898.668 |
| 0.6138888888888888 | 898.668 |
| 0.6145833333333334 | 902.447 |
| 0.6152777777777778 | 902.447 |
| 0.6159722222222223 | 902.447 |
| 0.6166666666666667 | 894.885 |
| 0.6173611111111111 | 887.309 |
| 0.6180555555555556 | 883.516 |
| 0.61875 | 879.719 |
| 0.6194444444444445 | 875.918 |
| 0.6201388888888889 | 853.029 |
| 0.6208333333333333 | 654.791 |
| 0.6215277777777778 | 849.199 |
| 0.6222222222222222 | 849.199 |
| 0.6229166666666667 | 841.526 |
| 0.6236111111111111 | 837.682 |
| 0.6243055555555556 | 829.981 |
| 0.625 | 841.526 |
| 0.6256944444444444 | 841.526 |
| 0.6263888888888889 | 833.834 |
| 0.6270833333333333 | 833.834 |
| 0.6277777777777778 | 829.981 |
| 0.6284722222222222 | 826.123 |
| 0.6291666666666667 | 795.074 |
| 0.6298611111111111 | 806.757 |
| 0.6305555555555555 | 806.757 |
| 0.63125 | 802.868 |
| 0.6319444444444444 | 798.974 |
| 0.6326388888888889 | 795.074 |
| 0.6333333333333333 | 791.169 |
| 0.6340277777777777 | 787.258 |
| 0.6347222222222222 | 783.342 |
| 0.6354166666666666 | 775.492 |
| 0.6361111111111112 | 771.559 |
| 0.6368055555555555 | 763.674 |
| 0.6375000000000001 | 755.766 |
| 0.6381944444444444 | 751.803 |
| 0.638888888888889 | 743.859 |
| 0.6395833333333333 | 735.89 |
| 0.6402777777777778 | 731.896 |
| 0.6409722222222222 | 727.896 |
| 0.6416666666666667 | 719.877 |
| 0.642361111111111 | 711.832 |
| 0.6430555555555556 | 699.717 |
| 0.6437499999999999 | 699.717 |
| 0.6444444444444445 | 699.717 |
| 0.6451388888888888 | 695.666 |
| 0.6458333333333334 | 691.608 |
| 0.6465277777777778 | 683.473 |
| 0.6472222222222223 | 675.311 |
| 0.6479166666666667 | 667.123 |
| 0.6486111111111111 | 658.909 |
| 0.6493055555555556 | 646.537 |
| 0.65 | 638.256 |
| 0.6506944444444445 | 629.948 |
| 0.6513888888888889 | 625.784 |
| 0.6520833333333333 | 617.436 |
| 0.6527777777777778 | 609.062 |
| 0.6534722222222222 | 600.661 |
| 0.6541666666666667 | 592.233 |
| 0.6548611111111111 | 583.779 |
| 0.6555555555555556 | 579.542 |
| 0.65625 | 571.049 |
| 0.6569444444444444 | 562.53 |
| 0.6576388888888889 | 553.986 |
| 0.6583333333333333 | 545.416 |
| 0.6590277777777778 | 536.82 |
| 0.6597222222222222 | 528.2 |
| 0.6604166666666667 | 519.555 |
| 0.6611111111111111 | 510.885 |
| 0.6618055555555555 | 502.192 |
| 0.6625 | 497.836 |
| 0.6631944444444444 | 493.475 |
| 0.6638888888888889 | 489.108 |
| 0.6645833333333333 | 480.356 |
| 0.6652777777777777 | 471.582 |
| 0.6659722222222222 | 462.786 |
| 0.6666666666666666 | 453.968 |
| 0.6673611111111111 | 445.129 |
| 0.6680555555555556 | 436.27 |
| 0.6687500000000001 | 427.39 |
| 0.6694444444444444 | 418.492 |
| 0.6701388888888888 | 405.108 |
| 0.6708333333333334 | 391.685 |
| 0.6715277777777778 | 373.729 |
| 0.6722222222222222 | 364.728 |
| 0.6729166666666666 | 355.712 |
| 0.6736111111111112 | 351.198 |
| 0.6743055555555556 | 337.639 |
| 0.6749999999999999 | 328.584 |
| 0.6756944444444444 | 310.44 |
| 0.6763888888888889 | 283.156 |
| 0.6770833333333334 | 251.251 |
| 0.6777777777777777 | 233 |
| 0.6784722222222223 | 228.436 |
| 0.6791666666666667 | 223.873 |
| 0.6798611111111111 | 219.309 |
| 0.6805555555555555 | 219.309 |
| 0.68125 | 219.309 |
| 0.6819444444444445 | 214.746 |
| 0.6826388888888889 | 210.182 |
| 0.6833333333333332 | 210.182 |
| 0.6840277777777778 | 210.182 |
| 0.6847222222222222 | 205.62 |
| 0.6854166666666667 | 205.62 |
| 0.686111111111111 | 205.62 |
| 0.6868055555555556 | 201.058 |
| 0.6875 | 201.058 |
| 0.6881944444444444 | 201.058 |
| 0.688888888888889 | 201.058 |
| 0.6895833333333333 | 196.497 |
| 0.6902777777777778 | 196.497 |
| 0.6909722222222222 | 191.937 |
| 0.6916666666666668 | 191.937 |
| 0.6923611111111111 | 191.937 |
| 0.6930555555555555 | 191.937 |
| 0.69375 | 187.378 |
| 0.6944444444444445 | 187.378 |
| 0.6951388888888889 | 187.378 |
| 0.6958333333333333 | 182.82 |
| 0.6965277777777777 | 182.82 |
| 0.6972222222222223 | 182.82 |
| 0.6979166666666666 | 182.82 |
| 0.6986111111111111 | 182.82 |
| 0.6993055555555556 | 182.82 |
| 0.7000000000000001 | 178.264 |
| 0.7006944444444444 | 178.264 |
| 0.7013888888888888 | 173.709 |
| 0.7020833333333334 | 173.709 |
| 0.7027777777777778 | 173.709 |
| 0.7034722222222222 | 173.709 |
| 0.7041666666666666 | 169.156 |
| 0.7048611111111112 | 164.605 |
| 0.7055555555555556 | 160.056 |
| 0.7062499999999999 | 155.509 |
| 0.7069444444444444 | 155.509 |
| 0.7076388888888889 | 155.509 |
| 0.7083333333333334 | 150.964 |
| 0.7090277777777777 | 150.964 |
| 0.7097222222222223 | 146.423 |
| 0.7104166666666667 | 146.423 |
| 0.7111111111111111 | 146.423 |
| 0.7118055555555555 | 146.423 |
| 0.7125 | 146.423 |
| 0.7131944444444445 | 146.423 |
| 0.7138888888888889 | 146.423 |
| 0.7145833333333332 | 146.423 |
| 0.7152777777777778 | 141.884 |
| 0.7159722222222222 | 141.884 |
| 0.7166666666666667 | 141.884 |
| 0.717361111111111 | 141.884 |
| 0.7180555555555556 | 141.884 |
| 0.71875 | 137.347 |
| 0.7194444444444444 | 137.347 |
| 0.720138888888889 | 137.347 |
| 0.7208333333333333 | 137.347 |
| 0.7215277777777778 | 137.347 |
| 0.7222222222222222 | 137.347 |
| 0.7229166666666668 | 132.814 |
| 0.7236111111111111 | 132.814 |
| 0.7243055555555555 | 132.814 |
| 0.725 | 132.814 |
| 0.7256944444444445 | 132.814 |
| 0.7263888888888889 | 128.284 |
| 0.7270833333333333 | 128.284 |
| 0.7277777777777777 | 128.284 |
| 0.7284722222222223 | 128.284 |
| 0.7291666666666666 | 128.284 |
| 0.7298611111111111 | 128.284 |
| 0.7305555555555556 | 123.758 |
| 0.7312500000000001 | 123.758 |
| 0.7319444444444444 | 123.758 |
| 0.7326388888888888 | 119.235 |
| 0.7333333333333334 | 119.235 |
| 0.7340277777777778 | 119.235 |
| 0.7347222222222222 | 119.235 |
| 0.7354166666666666 | 119.235 |
| 0.7361111111111112 | 119.235 |
| 0.7368055555555556 | 119.235 |
| 0.7374999999999999 | 114.716 |
| 0.7381944444444444 | 114.716 |
| 0.7388888888888889 | 114.716 |
| 0.7395833333333334 | 110.201 |
| 0.7402777777777777 | 110.201 |
| 0.7409722222222223 | 110.201 |
| 0.7416666666666667 | 110.201 |
| 0.7423611111111111 | 110.201 |
| 0.7430555555555555 | 110.201 |
| 0.74375 | 105.69 |
| 0.7444444444444445 | 105.69 |
| 0.7451388888888889 | 105.69 |
| 0.7458333333333332 | 105.69 |
| 0.7465277777777778 | 105.69 |
| 0.7472222222222222 | 101.184 |
| 0.7479166666666667 | 101.184 |
| 0.748611111111111 | 101.184 |
| 0.7493055555555556 | 101.184 |
| 0.75 | 101.184 |
| 0.7506944444444444 | 101.184 |
| 0.751388888888889 | 101.184 |
| 0.7520833333333333 | 101.184 |
| 0.7527777777777778 | 96.682 |
| 0.7534722222222222 | 96.682 |
| 0.7541666666666668 | 96.682 |
| 0.7548611111111111 | 96.682 |
| 0.7555555555555555 | 92.184 |
| 0.75625 | 92.184 |
| 0.7569444444444445 | 92.184 |
| 0.7576388888888889 | 92.184 |
| 0.7583333333333333 | 92.184 |
| 0.7590277777777777 | 92.184 |
| 0.7597222222222223 | 92.184 |
| 0.7604166666666666 | 87.692 |
| 0.7611111111111111 | 87.692 |
| 0.7618055555555556 | 87.692 |
| 0.7625000000000001 | 87.692 |
| 0.7631944444444444 | 87.692 |
| 0.7638888888888888 | 83.205 |
| 0.7645833333333334 | 83.205 |
| 0.7652777777777778 | 83.205 |
| 0.7659722222222222 | 83.205 |
| 0.7666666666666666 | 78.722 |
| 0.7673611111111112 | 78.722 |
| 0.7680555555555556 | 78.722 |
| 0.7687499999999999 | 78.722 |
| 0.7694444444444444 | 74.246 |
| 0.7701388888888889 | 74.246 |
| 0.7708333333333334 | 74.246 |
| 0.7715277777777777 | 74.246 |
| 0.7722222222222223 | 69.775 |
| 0.7729166666666667 | 69.775 |
| 0.7736111111111111 | 65.31 |
| 0.7743055555555555 | 65.31 |
| 0.775 | 65.31 |
| 0.7756944444444445 | 65.31 |
| 0.7763888888888889 | 60.85 |
| 0.7770833333333332 | 60.85 |
| 0.7777777777777778 | 60.85 |
| 0.7784722222222222 | 56.398 |
| 0.7791666666666667 | 56.398 |
| 0.779861111111111 | 56.398 |
| 0.7805555555555556 | 56.398 |
| 0.78125 | 51.951 |
| 0.7819444444444444 | 51.951 |
| 0.782638888888889 | 51.951 |
| 0.7833333333333333 | 51.951 |
| 0.7840277777777778 | 47.511 |
| 0.7847222222222222 | 47.511 |
| 0.7854166666666668 | 47.511 |
| 0.7861111111111111 | 47.511 |
| 0.7868055555555555 | 47.511 |
| 0.7875 | 43.079 |
| 0.7881944444444445 | 43.079 |
| 0.7888888888888889 | 43.079 |
| 0.7895833333333333 | 43.079 |
| 0.7902777777777777 | 38.653 |
| 0.7909722222222223 | 38.653 |
| 0.7916666666666666 | 38.653 |
| 0.7923611111111111 | 38.653 |
| 0.7930555555555556 | 34.234 |
| 0.7937500000000001 | 34.234 |
| 0.7944444444444444 | 34.234 |
| 0.7951388888888888 | 29.823 |
| 0.7958333333333334 | 29.823 |
| 0.7965277777777778 | 29.823 |
| 0.7972222222222222 | 29.823 |
| 0.7979166666666666 | 29.823 |
| 0.7986111111111112 | 29.823 |
| 0.7993055555555556 | 25.419 |
| 0.7999999999999999 | 25.419 |
| 0.8006944444444444 | 25.419 |
| 0.8013888888888889 | 25.419 |
| 0.8020833333333334 | 21.024 |
| 0.8027777777777777 | 21.024 |
| 0.8034722222222223 | 21.024 |
| 0.8041666666666667 | 21.024 |
| 0.8048611111111111 | 21.024 |
| 0.8055555555555555 | 16.636 |
| 0.80625 | 16.636 |
| 0.8069444444444445 | 16.636 |
| 0.8076388888888889 | 16.636 |
| 0.8083333333333332 | 12.257 |
| 0.8090277777777778 | 12.257 |
| 0.8097222222222222 | 12.257 |
| 0.8104166666666667 | 12.257 |
| 0.811111111111111 | 12.257 |
| 0.8118055555555556 | 12.257 |
| 0.8125 | 7.887 |
| 0.8131944444444444 | 7.887 |
| 0.813888888888889 | 7.887 |
| 0.8145833333333333 | 7.887 |
| 0.8152777777777778 | 7.887 |
| 0.8159722222222222 | 7.887 |
| 0.8166666666666668 | 3.525 |
| 0.8173611111111111 | 3.525 |
| 0.8180555555555555 | 3.525 |
| 0.81875 | 3.525 |
| 0.8194444444444445 | 3.525 |
| 0.8201388888888889 | 3.525 |
| 0.8208333333333333 | 3.525 |
| 0.8215277777777777 | 0 |
| 0.8222222222222223 | 0 |
| 0.8229166666666666 | 0 |
| 0.8236111111111111 | 0 |
| 0.8243055555555556 | 0 |
| 0.8250000000000001 | 0 |
| 0.8256944444444444 | 0 |
| 0.8263888888888888 | 0 |
| 0.8270833333333334 | 0 |
| 0.8277777777777778 | 0 |
| 0.8284722222222222 | 0 |
| 0.8291666666666666 | 0 |
| 0.8298611111111112 | 0 |
| 0.8305555555555556 | 0 |
| 0.8312499999999999 | 0 |
| 0.8319444444444444 | 0 |
| 0.8326388888888889 | 0 |
| 0.8333333333333334 | 0 |
| 0.8340277777777777 | 0 |
| 0.8347222222222223 | 0 |
| 0.8354166666666667 | 0 |
| 0.8361111111111111 | 0 |
| 0.8368055555555555 | 0 |
| 0.8375 | 0 |
| 0.8381944444444445 | 0 |
| 0.8388888888888889 | 0 |
| 0.8395833333333332 | 0 |
| 0.8402777777777778 | 0 |
| 0.8409722222222222 | 0 |
| 0.8416666666666667 | 0 |
| 0.842361111111111 | 0 |
| 0.8430555555555556 | 0 |
| 0.84375 | 0 |
| 0.8444444444444444 | 0 |
| 0.845138888888889 | 0 |
| 0.8458333333333333 | 0 |
| 0.8465277777777778 | 0 |
| 0.8472222222222222 | 0 |
| 0.8479166666666668 | 0 |
| 0.8486111111111111 | 0 |
| 0.8493055555555555 | 0 |
| 0.85 | 0 |
| 0.8506944444444445 | 0 |
| 0.8513888888888889 | 0 |
| 0.8520833333333333 | 0 |
| 0.8527777777777777 | 0 |
| 0.8534722222222223 | 0 |
| 0.8541666666666666 | 0 |
| 0.8548611111111111 | 0 |
| 0.8555555555555556 | 0 |
| 0.8562500000000001 | 0 |
| 0.8569444444444444 | 0 |
| 0.8576388888888888 | 0 |
| 0.8583333333333334 | 0 |
| 0.8590277777777778 | 0 |
| 0.8597222222222222 | 0 |
| 0.8604166666666666 | 0 |
| 0.8611111111111112 | 0 |
| 0.8618055555555556 | 0 |
| 0.8624999999999999 | 0 |
| 0.8631944444444444 | 0 |
| 0.8638888888888889 | 0 |
| 0.8645833333333334 | 0 |
| 0.8652777777777777 | 0 |
| 0.8659722222222223 | 0 |
| 0.8666666666666667 | 0 |
| 0.8673611111111111 | 0 |
| 0.8680555555555555 | 0 |
| 0.86875 | 0 |
| 0.8694444444444445 | 0 |
| 0.8701388888888889 | 0 |
| 0.8708333333333332 | 0 |
| 0.8715277777777778 | 0 |
| 0.8722222222222222 | 0 |
| 0.8729166666666667 | 0 |
| 0.873611111111111 | 0 |
| 0.8743055555555556 | 0 |
| 0.875 | 0 |
| 0.8756944444444444 | 0 |
| 0.876388888888889 | 0 |
| 0.8770833333333333 | 0 |
| 0.8777777777777778 | 0 |
| 0.8784722222222222 | 0 |
| 0.8791666666666668 | 0 |
| 0.8798611111111111 | 0 |
| 0.8805555555555555 | 0 |
| 0.88125 | 0 |
| 0.8819444444444445 | 0 |
| 0.8826388888888889 | 0 |
| 0.8833333333333333 | 0 |
| 0.8840277777777777 | 0 |
| 0.8847222222222223 | 0 |
| 0.8854166666666666 | 0 |
| 0.8861111111111111 | 0 |
| 0.8868055555555556 | 0 |
| 0.8875000000000001 | 0 |
| 0.8881944444444444 | 0 |
| 0.8888888888888888 | 0 |
| 0.8895833333333334 | 0 |
| 0.8902777777777778 | 0 |
| 0.8909722222222222 | 0 |
| 0.8916666666666666 | 0 |
| 0.8923611111111112 | 0 |
| 0.8930555555555556 | 0 |
| 0.8937499999999999 | 0 |
| 0.8944444444444444 | 0 |
| 0.8951388888888889 | 0 |
| 0.8958333333333334 | 0 |
| 0.8965277777777777 | 0 |
| 0.8972222222222223 | 0 |
| 0.8979166666666667 | 0 |
| 0.8986111111111111 | 0 |
| 0.8993055555555555 | 0 |
| 0.9 | 0 |
| 0.9006944444444445 | 0 |
| 0.9013888888888889 | 0 |
| 0.9020833333333332 | 0 |
| 0.9027777777777778 | 0 |
| 0.9034722222222222 | 0 |
| 0.9041666666666667 | 0 |
| 0.904861111111111 | 0 |
| 0.9055555555555556 | 0 |
| 0.90625 | 0 |
| 0.9069444444444444 | 0 |
| 0.907638888888889 | 0 |
| 0.9083333333333333 | 0 |
| 0.9090277777777778 | 0 |
| 0.9097222222222222 | 0 |
| 0.9104166666666668 | 0 |
| 0.9111111111111111 | 0 |
| 0.9118055555555555 | 0 |
| 0.9125 | 0 |
| 0.9131944444444445 | 0 |
| 0.9138888888888889 | 0 |
| 0.9145833333333333 | 0 |
| 0.9152777777777777 | 0 |
| 0.9159722222222223 | 0 |
| 0.9166666666666666 | 0 |
| 0.9173611111111111 | 0 |
| 0.9180555555555556 | 0 |
| 0.9187500000000001 | 0 |
| 0.9194444444444444 | 0 |
| 0.9201388888888888 | 0 |
| 0.9208333333333334 | 0 |
| 0.9215277777777778 | 0 |
| 0.9222222222222222 | 0 |
| 0.9229166666666666 | 0 |
| 0.9236111111111112 | 0 |
| 0.9243055555555556 | 0 |
| 0.9249999999999999 | 0 |
| 0.9256944444444444 | 0 |
| 0.9263888888888889 | 0 |
| 0.9270833333333334 | 0 |
| 0.9277777777777777 | 0 |
| 0.9284722222222223 | 0 |
| 0.9291666666666667 | 0 |
| 0.9298611111111111 | 0 |
| 0.9305555555555555 | 0 |
| 0.93125 | 0 |
| 0.9319444444444445 | 0 |
| 0.9326388888888889 | 0 |
| 0.9333333333333332 | 0 |
| 0.9340277777777778 | 0 |
| 0.9347222222222222 | 0 |
| 0.9354166666666667 | 0 |
| 0.936111111111111 | 0 |
| 0.9368055555555556 | 0 |
| 0.9375 | 0 |
| 0.9381944444444444 | 0 |
| 0.938888888888889 | 0 |
| 0.9395833333333333 | 0 |
| 0.9402777777777778 | 0 |
| 0.9409722222222222 | 0 |
| 0.9416666666666668 | 0 |
| 0.9423611111111111 | 0 |
| 0.9430555555555555 | 0 |
| 0.94375 | 0 |
| 0.9444444444444445 | 0 |
| 0.9451388888888889 | 0 |
| 0.9458333333333333 | 0 |
| 0.9465277777777777 | 0 |
| 0.9472222222222223 | 0 |
| 0.9479166666666666 | 0 |
| 0.9486111111111111 | 0 |
| 0.9493055555555556 | 0 |
| 0.9500000000000001 | 0 |
| 0.9506944444444444 | 0 |
| 0.9513888888888888 | 0 |
| 0.9520833333333334 | 0 |
| 0.9527777777777778 | 0 |
| 0.9534722222222222 | 0 |
| 0.9541666666666666 | 0 |
| 0.9548611111111112 | 0 |
| 0.9555555555555556 | 0 |
| 0.9562499999999999 | 0 |
| 0.9569444444444444 | 0 |
| 0.9576388888888889 | 0 |
| 0.9583333333333334 | 0 |
| 0.9590277777777777 | 0 |
| 0.9597222222222223 | 0 |
| 0.9604166666666667 | 0 |
| 0.9611111111111111 | 0 |
| 0.9618055555555555 | 0 |
| 0.9625 | 0 |
| 0.9631944444444445 | 0 |
| 0.9638888888888889 | 0 |
| 0.9645833333333332 | 0 |
| 0.9652777777777778 | 0 |
| 0.9659722222222222 | 0 |
| 0.9666666666666667 | 0 |
| 0.967361111111111 | 0 |
| 0.9680555555555556 | 0 |
| 0.96875 | 0 |
| 0.9694444444444444 | 0 |
| 0.970138888888889 | 0 |
| 0.9708333333333333 | 0 |
| 0.9715277777777778 | 0 |
| 0.9722222222222222 | 0 |
| 0.9729166666666668 | 0 |
| 0.9736111111111111 | 0 |
| 0.9743055555555555 | 0 |
| 0.975 | 0 |
| 0.9756944444444445 | 0 |
| 0.9763888888888889 | 0 |
| 0.9770833333333333 | 0 |
| 0.9777777777777777 | 0 |
| 0.9784722222222223 | 0 |
| 0.9791666666666666 | 0 |
| 0.9798611111111111 | 0 |
| 0.9805555555555556 | 0 |
| 0.9812500000000001 | 0 |
| 0.9819444444444444 | 0 |
| 0.9826388888888888 | 0 |
| 0.9833333333333334 | 0 |
| 0.9840277777777778 | 0 |
| 0.9847222222222222 | 0 |
| 0.9854166666666666 | 0 |
| 0.9861111111111112 | 0 |
| 0.9868055555555556 | 0 |
| 0.9874999999999999 | 0 |
| 0.9881944444444444 | 0 |
| 0.9888888888888889 | 0 |
| 0.9895833333333334 | 0 |
| 0.9902777777777777 | 0 |
| 0.9909722222222223 | 0 |
| 0.9916666666666667 | 0 |
| 0.9923611111111111 | 0 |
| 0.9930555555555555 | 0 |
| 0.99375 | 0 |
| 0.9944444444444445 | 0 |
| 0.9951388888888889 | 0 |
| 0.9958333333333332 | 0 |
| 0.9965277777777778 | 0 |
| 0.9972222222222222 | 0 |
| 0.9979166666666667 | 0 |
| 0.998611111111111 | 0 |
| 0.9993055555555556 | 0 |